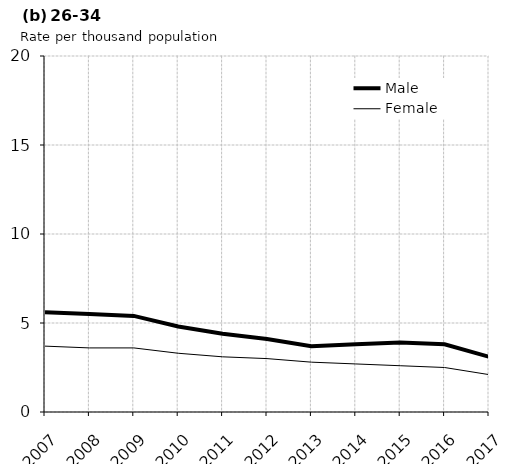
| Category | Male | Female |
|---|---|---|
| 2007.0 | 5.6 | 3.7 |
| 2008.0 | 5.5 | 3.6 |
| 2009.0 | 5.4 | 3.6 |
| 2010.0 | 4.8 | 3.3 |
| 2011.0 | 4.4 | 3.1 |
| 2012.0 | 4.1 | 3 |
| 2013.0 | 3.7 | 2.8 |
| 2014.0 | 3.8 | 2.7 |
| 2015.0 | 3.9 | 2.6 |
| 2016.0 | 3.8 | 2.5 |
| 2017.0 | 3.1 | 2.1 |